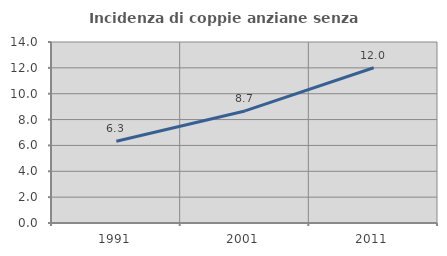
| Category | Incidenza di coppie anziane senza figli  |
|---|---|
| 1991.0 | 6.321 |
| 2001.0 | 8.667 |
| 2011.0 | 12.009 |